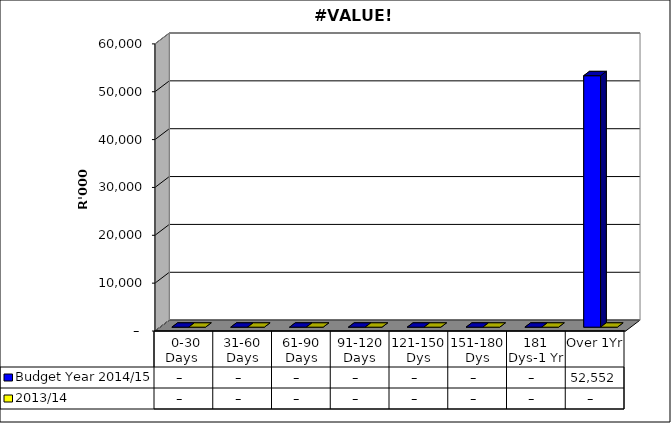
| Category | Budget Year 2014/15 | 2013/14 |
|---|---|---|
|  0-30 Days  | 0 | 0 |
| 31-60 Days | 0 | 0 |
| 61-90 Days | 0 | 0 |
| 91-120 Days | 0 | 0 |
| 121-150 Dys | 0 | 0 |
| 151-180 Dys | 0 | 0 |
| 181 Dys-1 Yr | 0 | 0 |
| Over 1Yr | 52552308 | 0 |